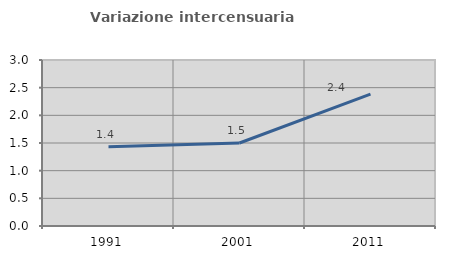
| Category | Variazione intercensuaria annua |
|---|---|
| 1991.0 | 1.434 |
| 2001.0 | 1.5 |
| 2011.0 | 2.384 |